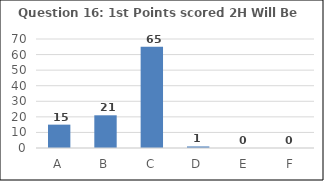
| Category | Series 0 |
|---|---|
| A | 15 |
| B | 21 |
| C | 65 |
| D | 1 |
| E | 0 |
| F | 0 |